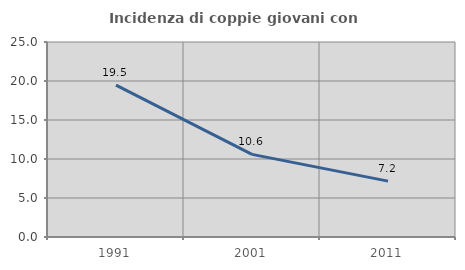
| Category | Incidenza di coppie giovani con figli |
|---|---|
| 1991.0 | 19.48 |
| 2001.0 | 10.59 |
| 2011.0 | 7.16 |